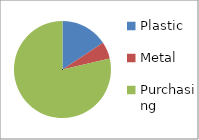
| Category | Series 0 |
|---|---|
| Plastic | 7800 |
| Metal | 2800 |
| Purchasing | 39000 |